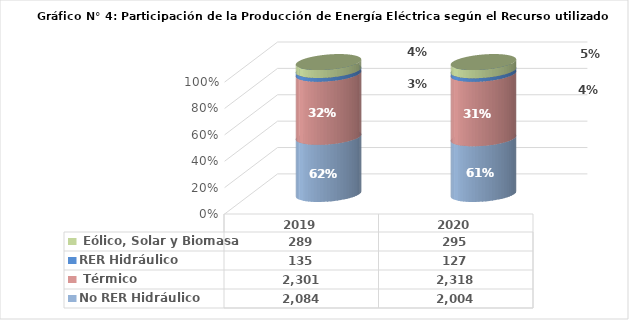
| Category | No RER | RER |
|---|---|---|
| 2019.0 | 2300.872 | 289.217 |
| 2020.0 | 2318.43 | 295.466 |